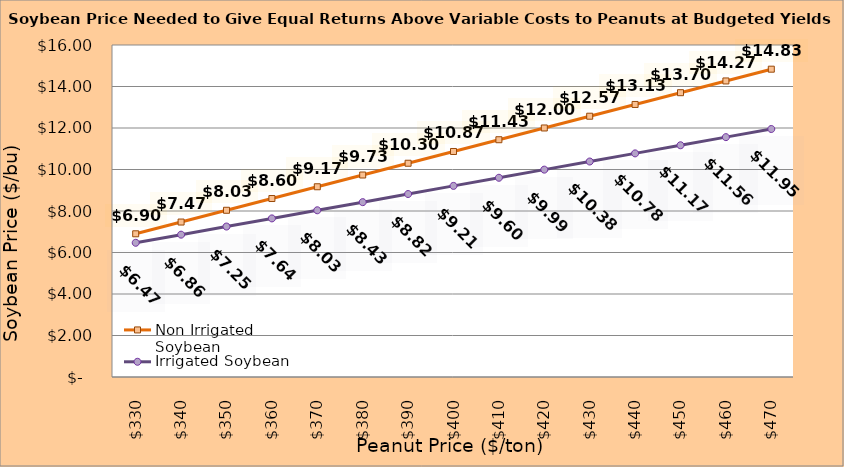
| Category | Non Irrigated Soybean | Irrigated Soybean |
|---|---|---|
| 330.0 | 6.901 | 6.468 |
| 340.0 | 7.468 | 6.86 |
| 350.0 | 8.035 | 7.251 |
| 360.0 | 8.601 | 7.643 |
| 370.0 | 9.168 | 8.035 |
| 380.0 | 9.735 | 8.426 |
| 390.0 | 10.301 | 8.818 |
| 400.0 | 10.868 | 9.21 |
| 410.0 | 11.435 | 9.601 |
| 420.0 | 12.001 | 9.993 |
| 430.0 | 12.568 | 10.385 |
| 440.0 | 13.135 | 10.776 |
| 450.0 | 13.701 | 11.168 |
| 460.0 | 14.268 | 11.56 |
| 470.0 | 14.835 | 11.951 |